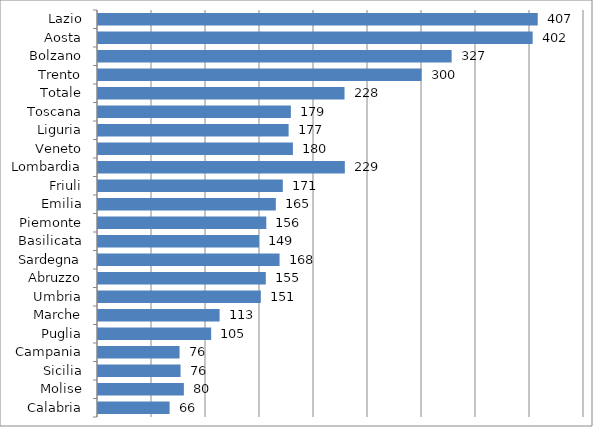
| Category | Series 0 |
|---|---|
| Lazio | 407.148 |
| Aosta | 402.449 |
| Bolzano | 327.446 |
| Trento | 299.584 |
| Totale | 228.269 |
| Toscana | 178.574 |
| Liguria | 176.503 |
| Veneto | 180.485 |
| Lombardia | 228.546 |
| Friuli | 171.125 |
| Emilia | 164.667 |
| Piemonte | 155.84 |
| Basilicata | 149.08 |
| Sardegna | 168.11 |
| Abruzzo | 155.379 |
| Umbria | 150.762 |
| Marche | 112.601 |
| Puglia | 104.797 |
| Campania | 75.52 |
| Sicilia | 76.433 |
| Molise | 79.507 |
| Calabria | 66.293 |